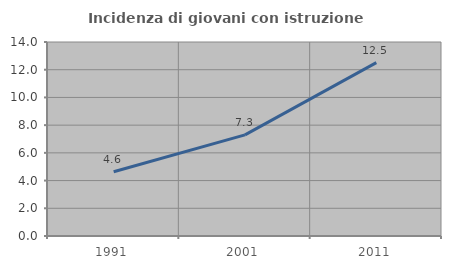
| Category | Incidenza di giovani con istruzione universitaria |
|---|---|
| 1991.0 | 4.636 |
| 2001.0 | 7.294 |
| 2011.0 | 12.515 |